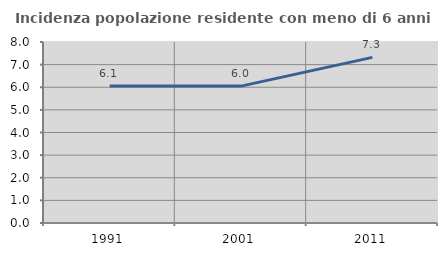
| Category | Incidenza popolazione residente con meno di 6 anni |
|---|---|
| 1991.0 | 6.061 |
| 2001.0 | 6.05 |
| 2011.0 | 7.321 |